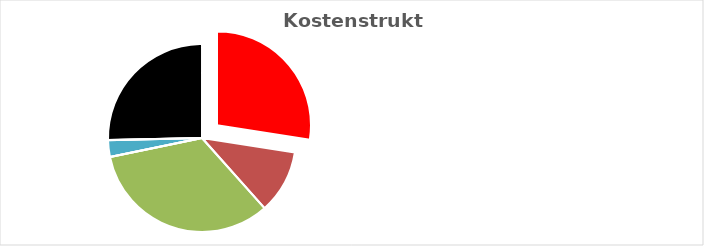
| Category | Series 0 |
|---|---|
| KV-Entgelt produktiv Tätige | 1 |
| Weitere Personalkosten produktiv | 0.399 |
| Personalnebenkosten | 1.214 |
| Unproduktives Personal | 0 |
| Deckung Personalgemeinkosten | 0.104 |
| Umlagen ohne GZ | 0 |
| Gesamtzuschlag | 0.924 |